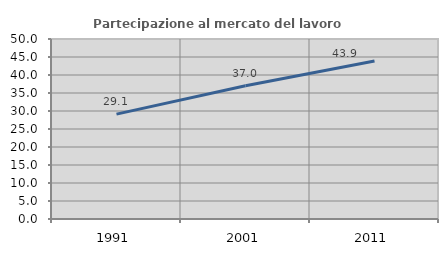
| Category | Partecipazione al mercato del lavoro  femminile |
|---|---|
| 1991.0 | 29.128 |
| 2001.0 | 36.994 |
| 2011.0 | 43.909 |